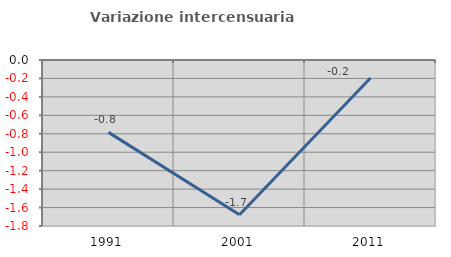
| Category | Variazione intercensuaria annua |
|---|---|
| 1991.0 | -0.785 |
| 2001.0 | -1.679 |
| 2011.0 | -0.196 |